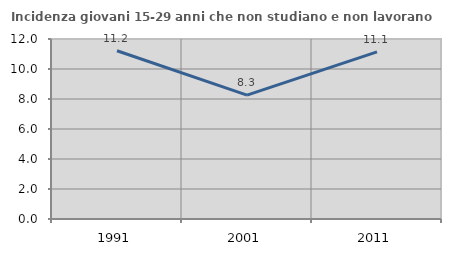
| Category | Incidenza giovani 15-29 anni che non studiano e non lavorano  |
|---|---|
| 1991.0 | 11.22 |
| 2001.0 | 8.26 |
| 2011.0 | 11.146 |